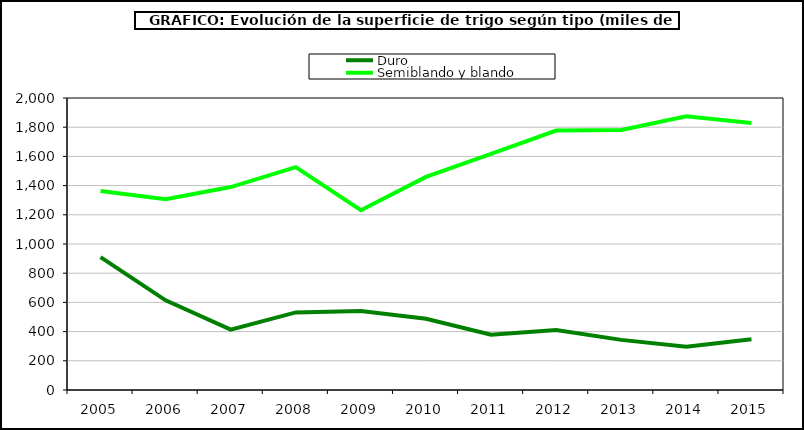
| Category | Duro | Semiblando y blando |
|---|---|---|
| 2005 | 910.448 | 1363.661 |
| 2006 | 614.021 | 1306.212 |
| 2007 | 413.41 | 1389.903 |
| 2008 | 531.661 | 1526.209 |
| 2009 | 541.581 | 1231.171 |
| 2010 | 488.306 | 1459.767 |
| 2011 | 378.054 | 1616.599 |
| 2012 | 411.053 | 1777.118 |
| 2013 | 343.389 | 1781.58 |
| 2014 | 297.13 | 1874.542 |
| 2015 | 347.93 | 1828.423 |